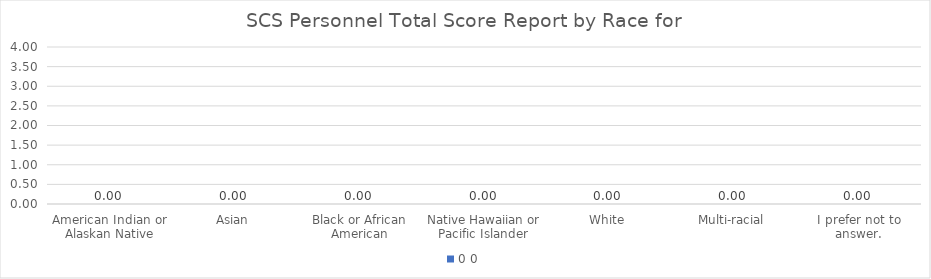
| Category | 0 |
|---|---|
| American Indian or Alaskan Native | 0 |
| Asian | 0 |
| Black or African American | 0 |
| Native Hawaiian or Pacific Islander | 0 |
| White | 0 |
| Multi-racial | 0 |
| I prefer not to answer. | 0 |